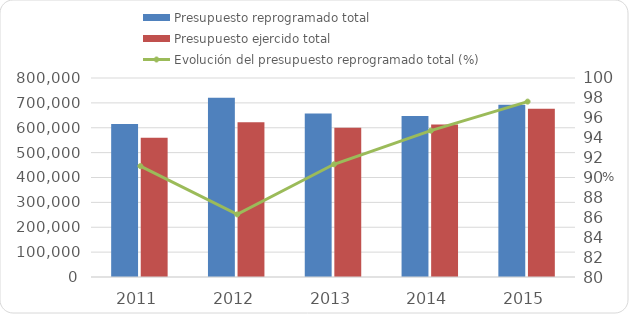
| Category | Presupuesto reprogramado total | Presupuesto ejercido total |
|---|---|---|
| 2011 | 614651 | 560225 |
| 2012 | 720679.2 | 621909.5 |
| 2013 | 657148.1 | 600163.1 |
| 2014 | 647302.9 | 613052.1 |
| 2015 | 692840.462 | 676403.338 |